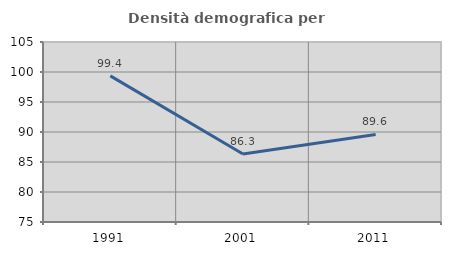
| Category | Densità demografica |
|---|---|
| 1991.0 | 99.357 |
| 2001.0 | 86.343 |
| 2011.0 | 89.596 |